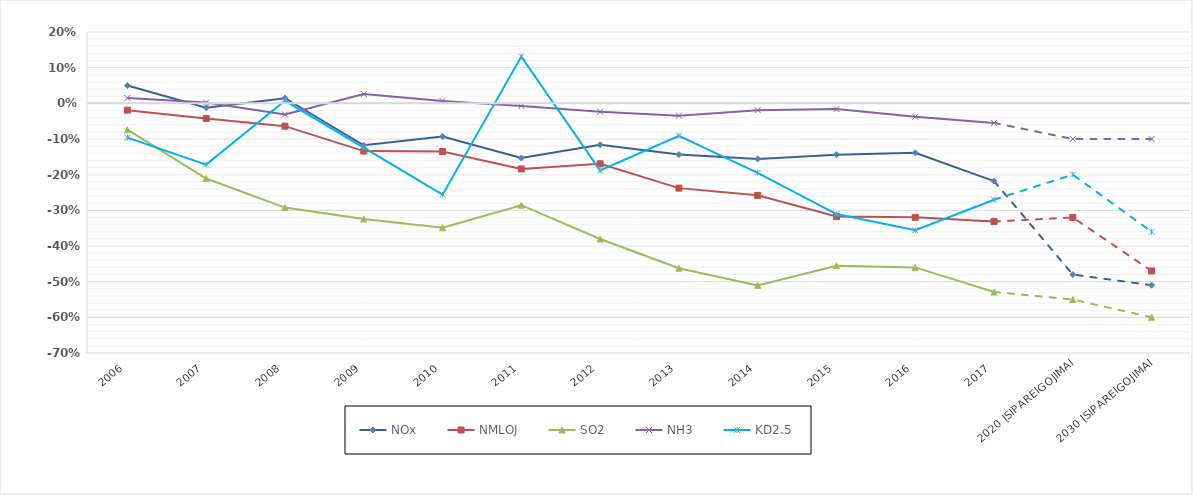
| Category | NOx | NMLOJ | SO2 | NH3 | KD2.5 |
|---|---|---|---|---|---|
| 2006 | 0.05 | -0.019 | -0.074 | 0.015 | -0.096 |
| 2007 | -0.012 | -0.042 | -0.211 | 0.002 | -0.172 |
| 2008 | 0.014 | -0.064 | -0.292 | -0.031 | 0.007 |
| 2009 | -0.118 | -0.134 | -0.324 | 0.026 | -0.124 |
| 2010 | -0.093 | -0.135 | -0.349 | 0.007 | -0.256 |
| 2011 | -0.153 | -0.184 | -0.286 | -0.007 | 0.131 |
| 2012 | -0.116 | -0.17 | -0.38 | -0.024 | -0.188 |
| 2013 | -0.144 | -0.238 | -0.462 | -0.034 | -0.091 |
| 2014 | -0.156 | -0.258 | -0.51 | -0.019 | -0.195 |
| 2015 | -0.144 | -0.318 | -0.455 | -0.016 | -0.31 |
| 2016 | -0.139 | -0.319 | -0.46 | -0.038 | -0.356 |
| 2017 | -0.218 | -0.331 | -0.529 | -0.055 | -0.27 |
| 2020 įsipareigojimai | -0.48 | -0.32 | -0.55 | -0.1 | -0.2 |
| 2030 įsipareigojimai | -0.51 | -0.47 | -0.6 | -0.1 | -0.36 |